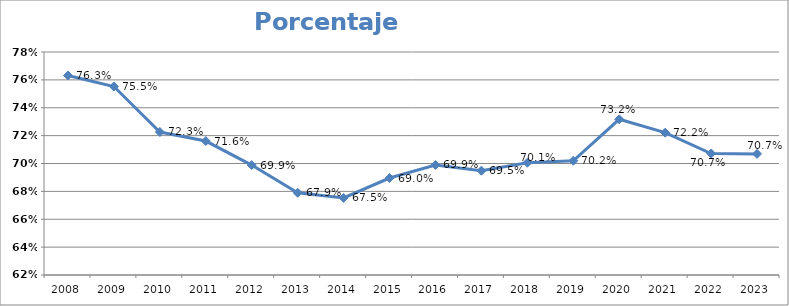
| Category | Porcentaje adoptadas |
|---|---|
| 2008.0 | 0.763 |
| 2009.0 | 0.755 |
| 2010.0 | 0.723 |
| 2011.0 | 0.716 |
| 2012.0 | 0.699 |
| 2013.0 | 0.679 |
| 2014.0 | 0.675 |
| 2015.0 | 0.69 |
| 2016.0 | 0.699 |
| 2017.0 | 0.695 |
| 2018.0 | 0.701 |
| 2019.0 | 0.702 |
| 2020.0 | 0.732 |
| 2021.0 | 0.722 |
| 2022.0 | 0.707 |
| 2023.0 | 0.707 |